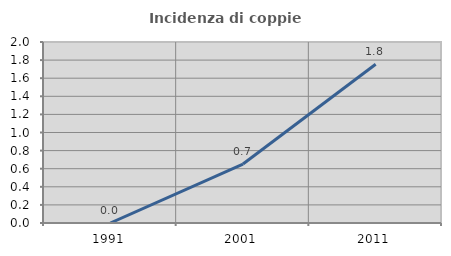
| Category | Incidenza di coppie miste |
|---|---|
| 1991.0 | 0 |
| 2001.0 | 0.651 |
| 2011.0 | 1.754 |